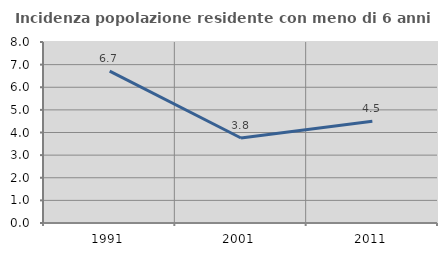
| Category | Incidenza popolazione residente con meno di 6 anni |
|---|---|
| 1991.0 | 6.711 |
| 2001.0 | 3.757 |
| 2011.0 | 4.502 |